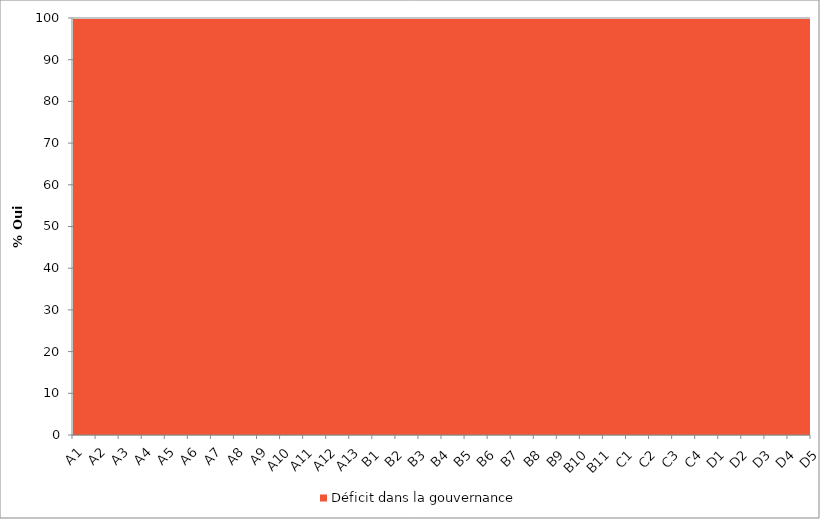
| Category | Déficit dans la gouvernance | % Oui |
|---|---|---|
| A1 | 100 | 0 |
| A2 | 100 | 0 |
| A3 | 100 | 0 |
| A4 | 100 | 0 |
| A5 | 100 | 0 |
| A6 | 100 | 0 |
| A7 | 100 | 0 |
| A8 | 100 | 0 |
| A9 | 100 | 0 |
| A10 | 100 | 0 |
| A11 | 100 | 0 |
| A12 | 100 | 0 |
| A13 | 100 | 0 |
| B1 | 100 | 0 |
| B2 | 100 | 0 |
| B3 | 100 | 0 |
| B4 | 100 | 0 |
| B5 | 100 | 0 |
| B6 | 100 | 0 |
| B7 | 100 | 0 |
| B8 | 100 | 0 |
| B9 | 100 | 0 |
| B10 | 100 | 0 |
| B11 | 100 | 0 |
| C1 | 100 | 0 |
| C2 | 100 | 0 |
| C3 | 100 | 0 |
| C4 | 100 | 0 |
| D1 | 100 | 0 |
| D2 | 100 | 0 |
| D3 | 100 | 0 |
| D4 | 100 | 0 |
| D5 | 100 | 0 |